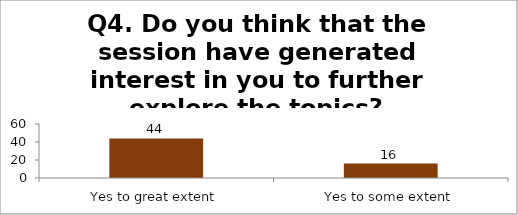
| Category | Q4. Do you think that the session have generated interest in you to further explore the topics? |
|---|---|
| Yes to great extent | 44 |
| Yes to some extent | 16 |